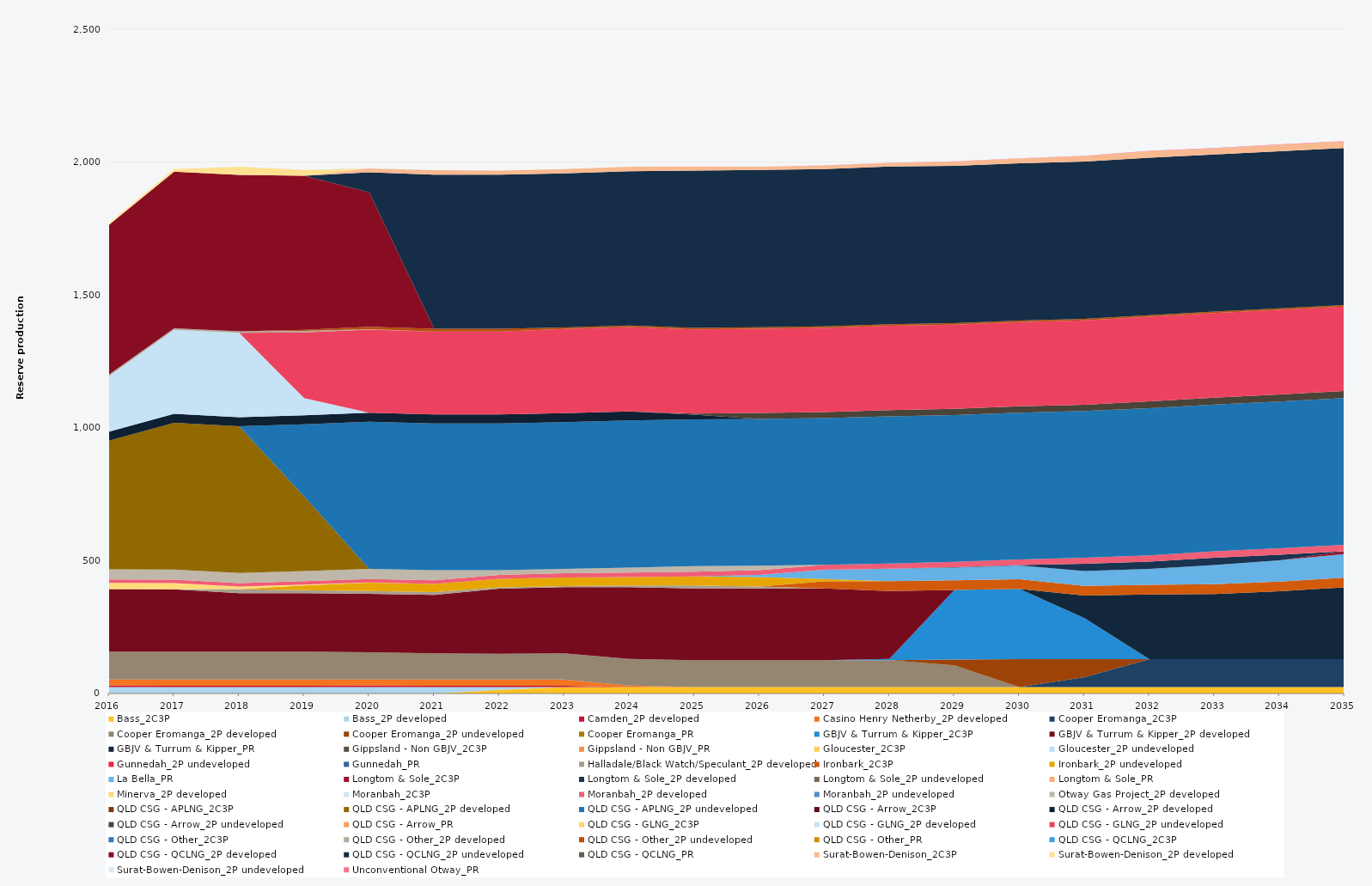
| Category | Bass_2C3P | Bass_2P developed | Camden_2P developed | Casino Henry Netherby_2P developed | Cooper Eromanga_2C3P | Cooper Eromanga_2P developed | Cooper Eromanga_2P undeveloped | Cooper Eromanga_PR | GBJV & Turrum & Kipper_2C3P | GBJV & Turrum & Kipper_2P developed | GBJV & Turrum & Kipper_PR | Gippsland - Non GBJV_2C3P | Gippsland - Non GBJV_PR | Gloucester_2C3P | Gloucester_2P undeveloped | Gunnedah_2P undeveloped | Gunnedah_PR | Halladale/Black Watch/Speculant_2P developed | Ironbark_2C3P | Ironbark_2P undeveloped | La Bella_PR | Longtom & Sole_2C3P | Longtom & Sole_2P developed | Longtom & Sole_2P undeveloped | Longtom & Sole_PR | Minerva_2P developed | Moranbah_2C3P | Moranbah_2P developed | Moranbah_2P undeveloped | Otway Gas Project_2P developed | QLD CSG - APLNG_2C3P | QLD CSG - APLNG_2P developed | QLD CSG - APLNG_2P undeveloped | QLD CSG - Arrow_2C3P | QLD CSG - Arrow_2P developed | QLD CSG - Arrow_2P undeveloped | QLD CSG - Arrow_PR | QLD CSG - GLNG_2C3P | QLD CSG - GLNG_2P developed | QLD CSG - GLNG_2P undeveloped | QLD CSG - Other_2C3P | QLD CSG - Other_2P developed | QLD CSG - Other_2P undeveloped | QLD CSG - Other_PR | QLD CSG - QCLNG_2C3P | QLD CSG - QCLNG_2P developed | QLD CSG - QCLNG_2P undeveloped | QLD CSG - QCLNG_PR | Surat-Bowen-Denison_2C3P | Surat-Bowen-Denison_2P developed | Surat-Bowen-Denison_2P undeveloped | Unconventional Otway_PR |
|---|---|---|---|---|---|---|---|---|---|---|---|---|---|---|---|---|---|---|---|---|---|---|---|---|---|---|---|---|---|---|---|---|---|---|---|---|---|---|---|---|---|---|---|---|---|---|---|---|---|---|---|---|
| 2016 | 0 | 24.522 | 5 | 23.12 | 0 | 105 | 0 | 0 | 0 | 235.041 | 0 | 0 | 0 | 0 | 0 | 0 | 0 | 0 | 0 | 0 | 0 | 0 | 0 | 0 | 0 | 23.79 | 0 | 12.867 | 0 | 38 | 0 | 484.599 | 0 | 0 | 34.038 | 0 | 0 | 0 | 208.948 | 0 | 0 | 5.856 | 0 | 0 | 0 | 563.525 | 0 | 0 | 0 | 5.979 | 0 | 0 |
| 2017 | 0 | 24.455 | 5 | 23.12 | 0 | 105 | 0 | 0 | 0 | 234.628 | 0 | 0 | 0 | 0 | 0 | 0 | 0 | 0 | 0 | 0 | 0 | 0 | 0 | 0 | 0 | 23.725 | 0 | 12.873 | 0 | 38 | 0 | 552.245 | 0 | 0 | 33.945 | 0 | 0 | 0 | 315.713 | 0 | 0 | 5.84 | 0 | 0 | 0 | 589.464 | 0 | 0 | 0 | 9.604 | 0 | 0 |
| 2018 | 0 | 24.455 | 5 | 23.12 | 0 | 105 | 0 | 0 | 0 | 220 | 0 | 0 | 0 | 0 | 0 | 0 | 0 | 15.424 | 0 | 0 | 0 | 0 | 0 | 0 | 0 | 9.373 | 0 | 13.04 | 0 | 38 | 0 | 552.245 | 0 | 0 | 33.945 | 0 | 0 | 0 | 317.886 | 0 | 0 | 5.84 | 0 | 0 | 0 | 588.841 | 0 | 0 | 0 | 30 | 0 | 0 |
| 2019 | 0 | 24.455 | 5 | 23.12 | 0 | 105 | 0 | 0 | 0 | 220 | 0 | 0 | 0 | 0 | 0 | 0 | 0 | 10.95 | 0 | 18.25 | 0 | 0 | 0 | 0 | 0 | 3.025 | 0 | 12.81 | 0 | 38 | 0 | 280.461 | 271.784 | 0 | 33.945 | 0 | 0 | 0 | 64.753 | 247.277 | 0 | 5.84 | 4.563 | 0 | 0 | 579.675 | 0 | 0 | 0 | 21.232 | 1.087 | 0 |
| 2020 | 0 | 24.522 | 5 | 23.12 | 0 | 102.21 | 0 | 0 | 0 | 220 | 0 | 0 | 0 | 0 | 0 | 0 | 0 | 10.95 | 0 | 31.573 | 0 | 0 | 0 | 0 | 0 | 0.837 | 0 | 12.781 | 0 | 38 | 0 | 0 | 553.758 | 0 | 34.038 | 0 | 0 | 0 | 0 | 312.817 | 0 | 1.624 | 8.795 | 0 | 0 | 505.894 | 75.509 | 0 | 14.319 | 0 | 0.913 | 0 |
| 2021 | 0 | 24.455 | 5 | 23.12 | 0 | 98.743 | 0 | 0 | 0 | 220 | 0 | 0 | 0 | 0 | 0 | 0 | 0 | 9.94 | 0 | 31.496 | 0 | 0 | 0 | 0 | 0 | 0 | 0 | 13.533 | 0 | 38 | 0 | 0 | 552.245 | 0 | 33.945 | 0 | 0 | 0 | 0 | 311.959 | 0 | 0 | 10.403 | 0 | 0 | 0 | 580.101 | 0 | 16.54 | 0 | 0 | 0 |
| 2022 | 13.672 | 10.783 | 5 | 23.12 | 0 | 97.216 | 0 | 0 | 0 | 244.607 | 0 | 0 | 0 | 0 | 0 | 0 | 0 | 4.849 | 0 | 32.138 | 0 | 0 | 0 | 0 | 0 | 0 | 0 | 15.298 | 0 | 17.796 | 0 | 0 | 552.245 | 0 | 33.945 | 0 | 0 | 0 | 0 | 311.898 | 0 | 0 | 10.403 | 0 | 0 | 0 | 579.606 | 0 | 15.502 | 0 | 0 | 0 |
| 2023 | 24.455 | 0 | 5 | 23.12 | 0 | 98.292 | 0 | 0 | 0 | 249.161 | 0 | 0 | 0 | 0 | 0 | 0 | 0 | 4.185 | 0 | 32.092 | 0 | 0 | 0 | 0 | 0 | 0 | 0 | 16.264 | 0 | 16.685 | 0 | 0 | 552.245 | 0 | 33.945 | 0 | 0 | 0 | 0 | 316.625 | 0 | 0 | 5.84 | 0 | 0 | 0 | 579.587 | 0 | 16.036 | 0 | 0 | 0 |
| 2024 | 24.522 | 0 | 0 | 5.3 | 0 | 100.02 | 0 | 0 | 0 | 270 | 0 | 0 | 0 | 0 | 0 | 0 | 0 | 6.767 | 0 | 31.833 | 0 | 0 | 0 | 0 | 0 | 0 | 0 | 16.79 | 0 | 18.867 | 0 | 0 | 553.758 | 0 | 34.038 | 0 | 0 | 0 | 0 | 317.359 | 0 | 0 | 5.856 | 0 | 0 | 0 | 580.592 | 0 | 16.464 | 0 | 0 | 0 |
| 2025 | 24.455 | 0 | 0 | 0 | 0 | 101.039 | 0 | 0 | 0 | 270 | 0 | 0 | 0 | 0 | 0 | 0 | 0 | 10.95 | 0 | 34.554 | 0 | 0 | 0 | 0 | 0 | 0 | 0 | 17.268 | 0 | 21.073 | 0 | 0 | 552.245 | 0 | 18.166 | 3.869 | 0 | 0 | 0 | 316.795 | 0 | 0 | 5.84 | 0 | 0 | 0 | 591.794 | 0 | 15.243 | 0 | 0 | 0 |
| 2026 | 24.455 | 0 | 0 | 0 | 0 | 100.577 | 0 | 0 | 0 | 270 | 0 | 0 | 0 | 0 | 0 | 0 | 0 | 7.985 | 0 | 35.404 | 7.64 | 0 | 0.185 | 0 | 0 | 0 | 0 | 17.518 | 0 | 17.185 | 0 | 0 | 552.245 | 0 | 0 | 22.841 | 0 | 0 | 0 | 316.693 | 0 | 0 | 5.84 | 0 | 0 | 0 | 591.753 | 0 | 12.395 | 0 | 0 | 0.205 |
| 2027 | 24.455 | 0 | 0 | 0 | 0 | 100.606 | 0 | 0 | 0 | 270 | 0 | 0 | 0 | 0 | 0 | 0 | 0 | 0 | 27.357 | 8.659 | 34.66 | 0 | 0.225 | 0 | 0 | 0 | 0 | 18.14 | 0 | 0 | 0 | 0 | 552.245 | 0 | 0 | 23.131 | 0 | 0 | 0 | 316.854 | 0 | 0 | 5.84 | 0 | 0 | 0 | 591.693 | 0 | 12.418 | 0 | 0 | 0.929 |
| 2028 | 24.522 | 0 | 0 | 0 | 0 | 100.844 | 0 | 0 | 4.942 | 255.67 | 0 | 0 | 0 | 0 | 0 | 0 | 0 | 0 | 36.6 | 0 | 47.244 | 0 | 0.21 | 0 | 0 | 0 | 0 | 18.99 | 0 | 0 | 0 | 0 | 553.758 | 0 | 0 | 23.47 | 0 | 0 | 0 | 317.828 | 0 | 0 | 5.856 | 0 | 0 | 0 | 593.234 | 0 | 13.255 | 0 | 0 | 0.755 |
| 2029 | 24.455 | 0 | 0 | 0 | 0 | 81.454 | 21.557 | 0 | 262.304 | 0 | 0 | 0 | 0 | 0 | 0 | 0 | 0 | 0 | 36.5 | 0 | 47.666 | 0 | 1.542 | 0 | 0 | 0 | 0 | 20.344 | 0 | 0 | 0 | 0 | 552.245 | 0 | 0 | 23.353 | 0 | 0 | 0 | 316.897 | 0 | 0 | 5.84 | 0 | 0 | 0 | 591.622 | 0 | 15.776 | 0 | 0 | 1.063 |
| 2030 | 24.455 | 0 | 0 | 0 | 0 | 0 | 105 | 0 | 264.048 | 0 | 0 | 0 | 0 | 0 | 0 | 0 | 0 | 0 | 36.5 | 0 | 51.57 | 0 | 1.592 | 0 | 0 | 0 | 0 | 21.608 | 0 | 0 | 0 | 0 | 552.245 | 0 | 0 | 23.602 | 0 | 0 | 0 | 317.279 | 0 | 0 | 5.84 | 0 | 0 | 0 | 591.579 | 0 | 17.949 | 0 | 0 | 0.71 |
| 2031 | 24.455 | 0 | 0 | 0 | 36.975 | 0 | 68.025 | 0 | 154.42 | 0 | 84.996 | 0 | 0 | 0 | 0 | 0 | 0 | 0 | 36.5 | 0 | 55.31 | 0 | 27.375 | 0 | 0 | 0 | 0 | 22.555 | 0 | 0 | 0 | 0 | 552.245 | 0 | 0 | 24.176 | 0 | 0 | 0 | 317.559 | 0 | 0 | 5.84 | 0 | 0 | 0 | 591.53 | 0 | 20.6 | 0 | 0 | 1.224 |
| 2032 | 24.522 | 0 | 0 | 0 | 105 | 0 | 0 | 0 | 0 | 0 | 242.918 | 0 | 0 | 0 | 0 | 0 | 0 | 0 | 36.6 | 0 | 60.276 | 0 | 27.45 | 0 | 0 | 0 | 0 | 23.473 | 0 | 0 | 0 | 0 | 553.758 | 0 | 0 | 25.27 | 0 | 0 | 0 | 318.687 | 0 | 0 | 5.856 | 0 | 0 | 0 | 593.07 | 0 | 23.715 | 0 | 0 | 2.019 |
| 2033 | 24.455 | 0 | 0 | 0 | 105 | 0 | 0 | 0 | 0 | 0 | 245.205 | 0 | 0 | 0 | 0 | 0 | 0 | 0 | 36.5 | 0 | 72.339 | 0 | 27.375 | 0 | 0 | 0 | 0 | 23.984 | 0 | 0 | 0 | 0 | 552.245 | 0 | 0 | 26.292 | 0 | 0 | 0 | 318.155 | 0 | 0 | 5.84 | 0 | 0 | 0 | 591.435 | 0 | 22.674 | 0 | 0 | 1.027 |
| 2034 | 24.455 | 0 | 0 | 0 | 105 | 0 | 0 | 0 | 0 | 0 | 255.21 | 0 | 0 | 0 | 0 | 0 | 0 | 0 | 36.5 | 0 | 79.989 | 0.375 | 20.527 | 0 | 0 | 0 | 0 | 24.559 | 0 | 0 | 0 | 0 | 552.245 | 0 | 0 | 26.478 | 0 | 0 | 0 | 318.338 | 0 | 0 | 5.84 | 0 | 0 | 0 | 591.394 | 0 | 23.82 | 0 | 0 | 1.784 |
| 2035 | 24.455 | 0 | 0 | 0 | 105 | 0 | 0 | 0 | 0 | 0 | 269.884 | 0 | 0 | 0 | 0 | 0 | 0 | 0 | 36.5 | 0 | 89.275 | 10.065 | 0 | 0 | 0 | 0 | 0 | 24.812 | 0 | 0 | 0 | 0 | 552.245 | 0 | 0 | 26.393 | 0 | 0 | 0 | 317.822 | 0 | 0 | 5.84 | 0 | 0 | 0 | 591.053 | 0 | 23.995 | 0 | 0 | 1.284 |